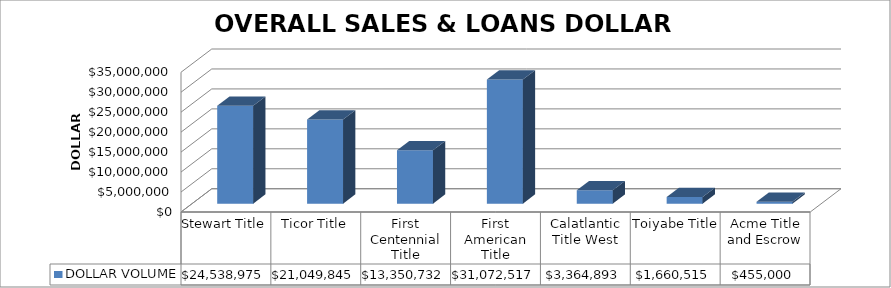
| Category | DOLLAR VOLUME |
|---|---|
| Stewart Title | 24538975 |
| Ticor Title | 21049845 |
| First Centennial Title | 13350732 |
| First American Title | 31072517 |
| Calatlantic Title West | 3364893 |
| Toiyabe Title | 1660515 |
| Acme Title and Escrow | 455000 |